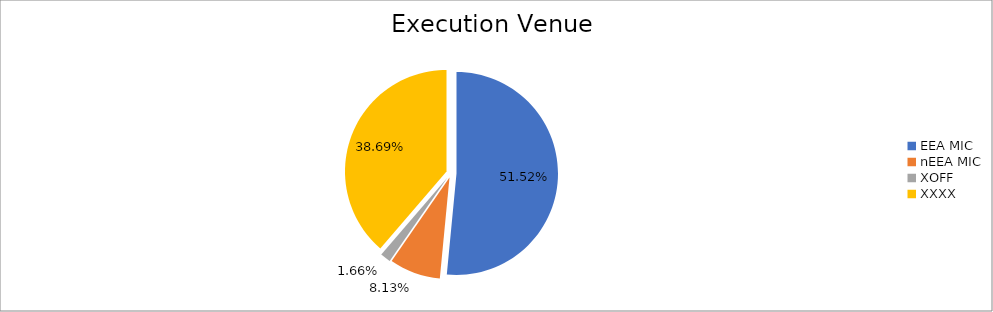
| Category | Series 0 |
|---|---|
| EEA MIC | 6771135.223 |
| nEEA MIC | 1068079.489 |
| XOFF | 218550.16 |
| XXXX | 5084218.042 |